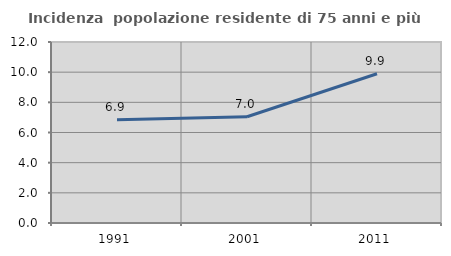
| Category | Incidenza  popolazione residente di 75 anni e più |
|---|---|
| 1991.0 | 6.853 |
| 2001.0 | 7.047 |
| 2011.0 | 9.896 |